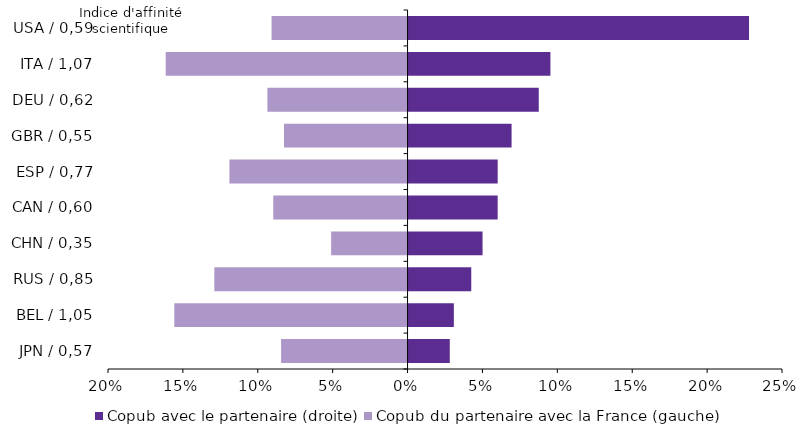
| Category | Copub avec le partenaire (droite) | Copub du partenaire avec la France (gauche) |
|---|---|---|
| JPN / 0,57 | 2.819 | -8.442 |
| BEL / 1,05 | 3.092 | -15.572 |
| RUS / 0,85 | 4.253 | -12.9 |
| CHN / 0,35 | 5.007 | -5.102 |
| CAN / 0,60 | 6.017 | -8.965 |
| ESP / 0,77 | 6.018 | -11.893 |
| GBR / 0,55 | 6.946 | -8.247 |
| DEU / 0,62 | 8.76 | -9.358 |
| ITA / 1,07 | 9.539 | -16.145 |
| USA / 0,59 | 22.798 | -9.078 |